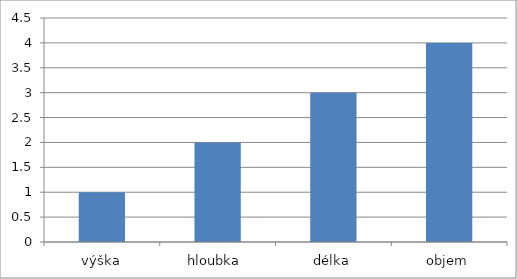
| Category | Series 0 |
|---|---|
| výška | 1 |
| hloubka  | 2 |
| délka | 3 |
| objem | 4 |